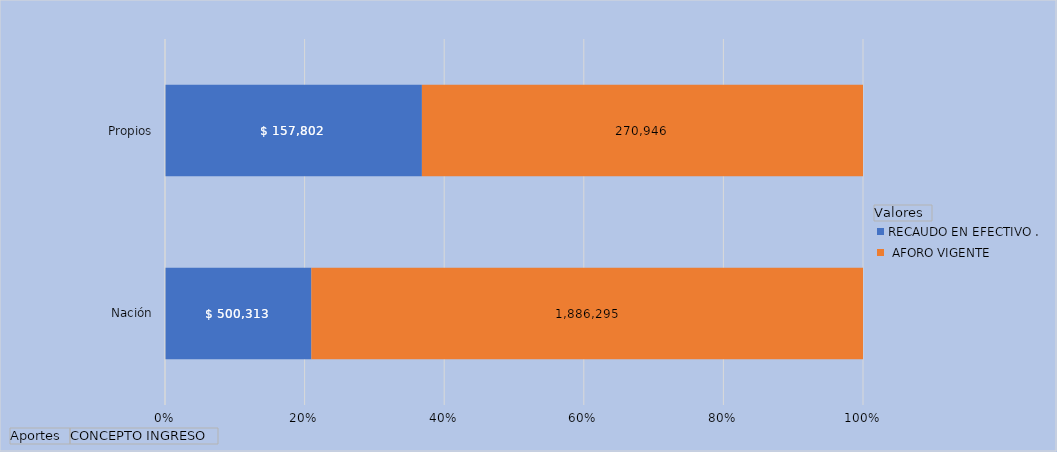
| Category | RECAUDO EN EFECTIVO . |  AFORO VIGENTE
 |
|---|---|---|
| Nación | 500313.184 | 1886294.901 |
| Propios | 157802.007 | 270945.743 |